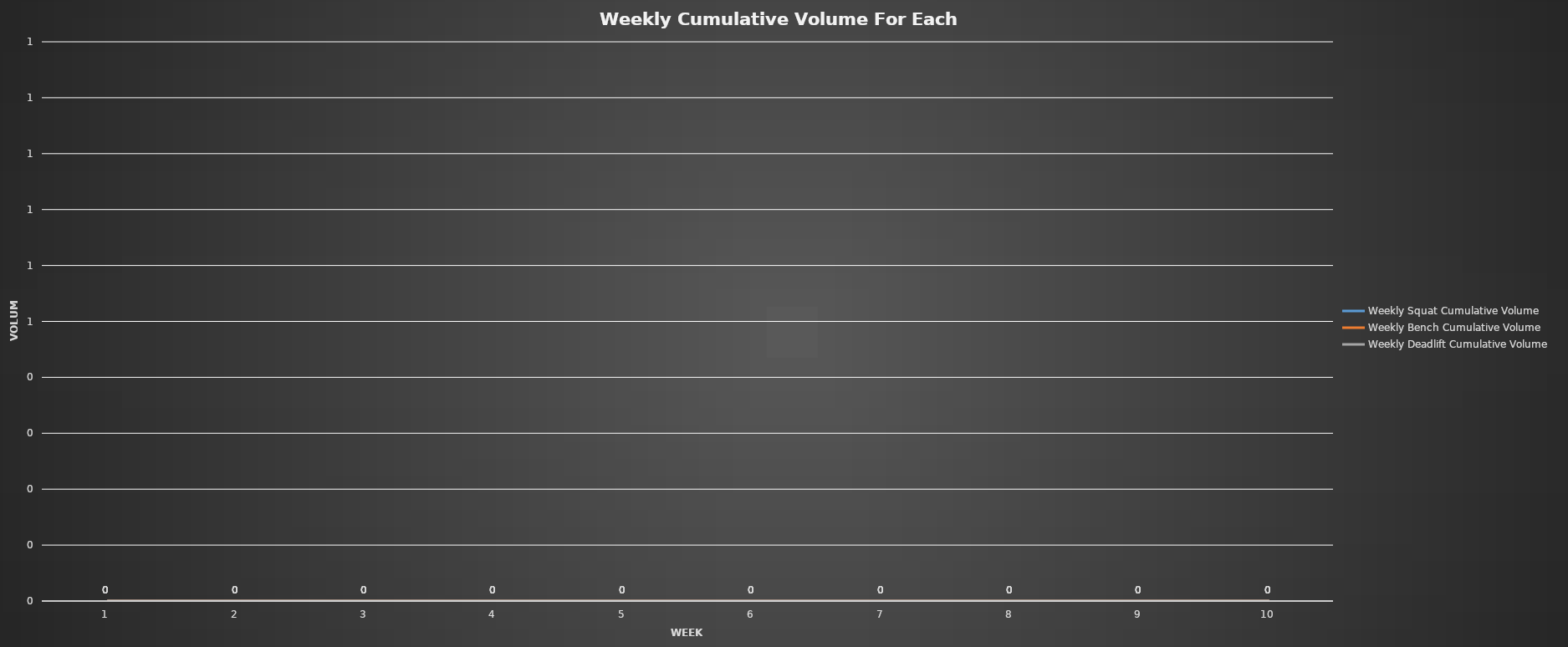
| Category | Weekly Squat Cumulative Volume | Weekly Bench Cumulative Volume | Weekly Deadlift Cumulative Volume |
|---|---|---|---|
| 0 | 0 | 0 | 0 |
| 1 | 0 | 0 | 0 |
| 2 | 0 | 0 | 0 |
| 3 | 0 | 0 | 0 |
| 4 | 0 | 0 | 0 |
| 5 | 0 | 0 | 0 |
| 6 | 0 | 0 | 0 |
| 7 | 0 | 0 | 0 |
| 8 | 0 | 0 | 0 |
| 9 | 0 | 0 | 0 |